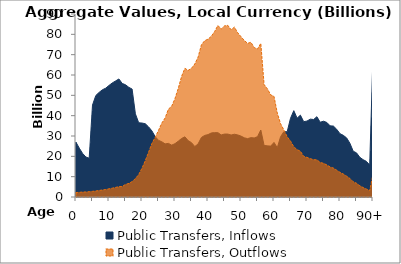
| Category | Public Transfers, Inflows | Public Transfers, Outflows |
|---|---|---|
| 0 | 26909.911 | 2185.393 |
|  | 24016.877 | 2287.612 |
| 2 | 21418.446 | 2450.218 |
| 3 | 19664.869 | 2490.823 |
| 4 | 19068.37 | 2609.119 |
| 5 | 45217.989 | 2775.508 |
| 6 | 49898.689 | 2965.661 |
| 7 | 51432.525 | 3208.264 |
| 8 | 52738.421 | 3458.388 |
| 9 | 53513.711 | 3702.676 |
| 10 | 54865.216 | 4019.014 |
| 11 | 56105.44 | 4341.423 |
| 12 | 57067.826 | 4707.456 |
| 13 | 58055.603 | 5086.673 |
| 14 | 55865.725 | 5164.429 |
| 15 | 55190.745 | 6178.356 |
| 16 | 53951.68 | 6669.997 |
| 17 | 53078.678 | 7572.496 |
| 18 | 40886.694 | 9044.749 |
| 19 | 36511.035 | 11026.686 |
| 20 | 36373.855 | 14163.622 |
| 21 | 36018.749 | 17862.445 |
| 22 | 34478.322 | 22051.782 |
| 23 | 32511.936 | 26319.681 |
| 24 | 29671.636 | 29345.533 |
| 25 | 27870.952 | 32750.254 |
| 26 | 27164.609 | 36348.089 |
| 27 | 26114.453 | 38857.52 |
| 28 | 26374.669 | 43185.45 |
| 29 | 25506.845 | 44654.897 |
| 30 | 26240.204 | 48420.487 |
| 31 | 27464.422 | 53449.25 |
| 32 | 28782.022 | 59349.726 |
| 33 | 29589.604 | 63281.148 |
| 34 | 27729.91 | 62281.076 |
| 35 | 26712.697 | 63311.857 |
| 36 | 24818.189 | 65397.683 |
| 37 | 26110.419 | 68797.476 |
| 38 | 29282.079 | 74845.842 |
| 39 | 30293.724 | 76885.216 |
| 40 | 30683.844 | 77614.116 |
| 41 | 31503.992 | 79038.152 |
| 42 | 31657.07 | 81342.309 |
| 43 | 31641.77 | 84354.199 |
| 44 | 30520.196 | 82601.728 |
| 45 | 30956.446 | 84160.763 |
| 46 | 30952.397 | 84419.614 |
| 47 | 30490.361 | 82253.879 |
| 48 | 30873.758 | 83536.645 |
| 49 | 30533.502 | 80795.092 |
| 50 | 29946.462 | 78840.422 |
| 51 | 29117.98 | 76966.597 |
| 52 | 28702.398 | 75557.285 |
| 53 | 29197.649 | 76089.637 |
| 54 | 29035.963 | 73495.393 |
| 55 | 29682.982 | 72811.601 |
| 56 | 32948.836 | 75565.421 |
| 57 | 25349.653 | 55299.608 |
| 58 | 25171.817 | 53202.33 |
| 59 | 25025.539 | 50227.652 |
| 60 | 26834.083 | 49485.294 |
| 61 | 24228.296 | 41261.968 |
| 62 | 29671.306 | 36018.864 |
| 63 | 32143.753 | 32954.727 |
| 64 | 32107.152 | 29617.259 |
| 65 | 38701.338 | 27514.545 |
| 66 | 42458.632 | 24703.154 |
| 67 | 38780.527 | 23286.792 |
| 68 | 40254.09 | 22512.465 |
| 69 | 37050.796 | 19985.119 |
| 70 | 37344.591 | 19477.855 |
| 71 | 38294.597 | 18865.941 |
| 72 | 38110.513 | 18345.012 |
| 73 | 39486.531 | 18276.772 |
| 74 | 36769.914 | 16977.353 |
| 75 | 37277.447 | 16576.328 |
| 76 | 36669.276 | 15767.842 |
| 77 | 35006.061 | 14771.011 |
| 78 | 34882.742 | 14237.229 |
| 79 | 33298.923 | 13188.56 |
| 80 | 31122.956 | 12102.489 |
| 81 | 30336.385 | 11285.937 |
| 82 | 29076.032 | 10256.387 |
| 83 | 26429.328 | 9132.713 |
| 84 | 22532.861 | 7521.687 |
| 85 | 21707.395 | 6749.92 |
| 86 | 19534.027 | 5556.019 |
| 87 | 18367.933 | 4659.956 |
| 88 | 17520.713 | 3910.98 |
| 89 | 15724.473 | 3124.627 |
| 90+ | 69788.78 | 11125.712 |